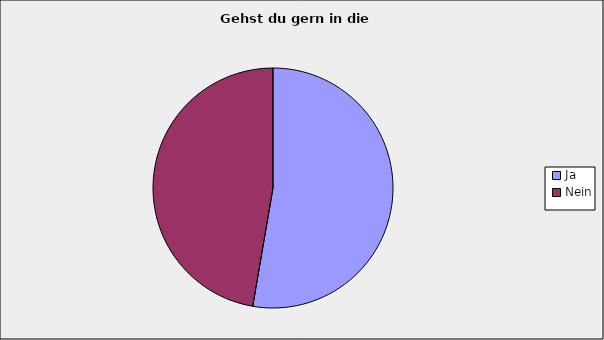
| Category | Series 0 |
|---|---|
| Ja | 0.527 |
| Nein | 0.473 |